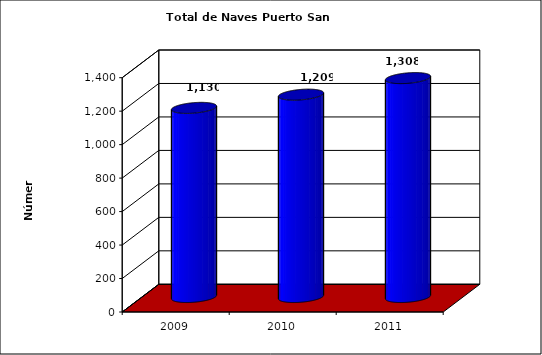
| Category | Series 0 |
|---|---|
| 2009.0 | 1130 |
| 2010.0 | 1209 |
| 2011.0 | 1308 |